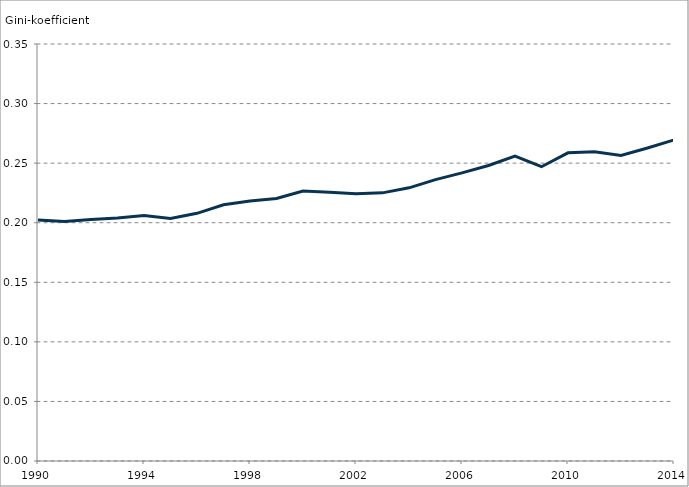
| Category | Series 0 |
|---|---|
| 1990.0 | 0.202 |
| 1991.0 | 0.201 |
| 1992.0 | 0.203 |
| 1993.0 | 0.204 |
| 1994.0 | 0.206 |
| 1995.0 | 0.204 |
| 1996.0 | 0.208 |
| 1997.0 | 0.215 |
| 1998.0 | 0.218 |
| 1999.0 | 0.22 |
| 2000.0 | 0.227 |
| 2001.0 | 0.226 |
| 2002.0 | 0.224 |
| 2003.0 | 0.225 |
| 2004.0 | 0.229 |
| 2005.0 | 0.236 |
| 2006.0 | 0.242 |
| 2007.0 | 0.248 |
| 2008.0 | 0.256 |
| 2009.0 | 0.247 |
| 2010.0 | 0.259 |
| 2011.0 | 0.26 |
| 2012.0 | 0.256 |
| 2013.0 | 0.263 |
| 2014.0 | 0.269 |